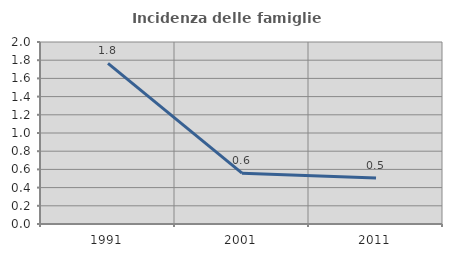
| Category | Incidenza delle famiglie numerose |
|---|---|
| 1991.0 | 1.765 |
| 2001.0 | 0.559 |
| 2011.0 | 0.506 |